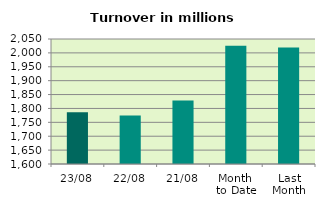
| Category | Series 0 |
|---|---|
| 23/08 | 1786.424 |
| 22/08 | 1774.662 |
| 21/08 | 1828.757 |
| Month 
to Date | 2025.672 |
| Last
Month | 2019.592 |